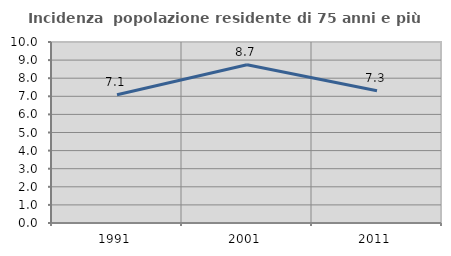
| Category | Incidenza  popolazione residente di 75 anni e più |
|---|---|
| 1991.0 | 7.089 |
| 2001.0 | 8.739 |
| 2011.0 | 7.308 |